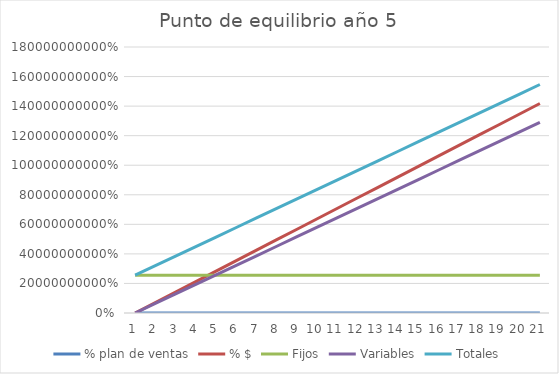
| Category | % plan de ventas | % $ | Fijos | Variables | Totales |
|---|---|---|---|---|---|
| 0 | 0 | 0 | 255896566.166 | 0 | 255896566.166 |
| 1 | 0.05 | 70875000 | 255896566.166 | 64515480.223 | 320412046.39 |
| 2 | 0.1 | 141750000 | 255896566.166 | 129030960.447 | 384927526.613 |
| 3 | 0.15 | 212625000 | 255896566.166 | 193546440.67 | 449443006.836 |
| 4 | 0.2 | 283500000 | 255896566.166 | 258061920.893 | 513958487.06 |
| 5 | 0.25 | 354375000 | 255896566.166 | 322577401.117 | 578473967.283 |
| 6 | 0.3 | 425250000 | 255896566.166 | 387092881.34 | 642989447.506 |
| 7 | 0.35 | 496125000 | 255896566.166 | 451608361.563 | 707504927.73 |
| 8 | 0.4 | 567000000 | 255896566.166 | 516123841.787 | 772020407.953 |
| 9 | 0.45 | 637875000 | 255896566.166 | 580639322.01 | 836535888.176 |
| 10 | 0.5 | 708750000 | 255896566.166 | 645154802.233 | 901051368.4 |
| 11 | 0.55 | 779625000 | 255896566.166 | 709670282.456 | 965566848.623 |
| 12 | 0.6 | 850500000 | 255896566.166 | 774185762.68 | 1030082328.846 |
| 13 | 0.65 | 921375000 | 255896566.166 | 838701242.903 | 1094597809.069 |
| 14 | 0.7 | 992250000 | 255896566.166 | 903216723.126 | 1159113289.293 |
| 15 | 0.75 | 1063125000 | 255896566.166 | 967732203.35 | 1223628769.516 |
| 16 | 0.8 | 1134000000 | 255896566.166 | 1032247683.573 | 1288144249.739 |
| 17 | 0.85 | 1204875000 | 255896566.166 | 1096763163.796 | 1352659729.963 |
| 18 | 0.9 | 1275750000 | 255896566.166 | 1161278644.02 | 1417175210.186 |
| 19 | 0.95 | 1346625000 | 255896566.166 | 1225794124.243 | 1481690690.409 |
| 20 | 1 | 1417500000 | 255896566.166 | 1290309604.466 | 1546206170.633 |